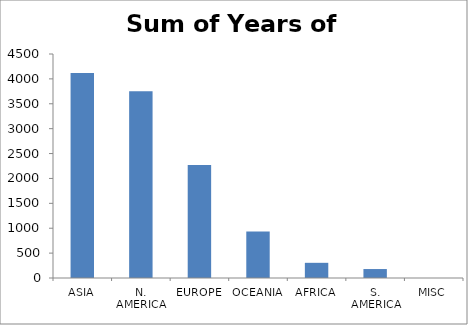
| Category | Sum of Years of Experience |
|---|---|
| ASIA | 4118.1 |
| N. AMERICA | 3752 |
| EUROPE | 2268 |
| OCEANIA | 933.5 |
| AFRICA | 305 |
| S. AMERICA | 180 |
| MISC | 0 |